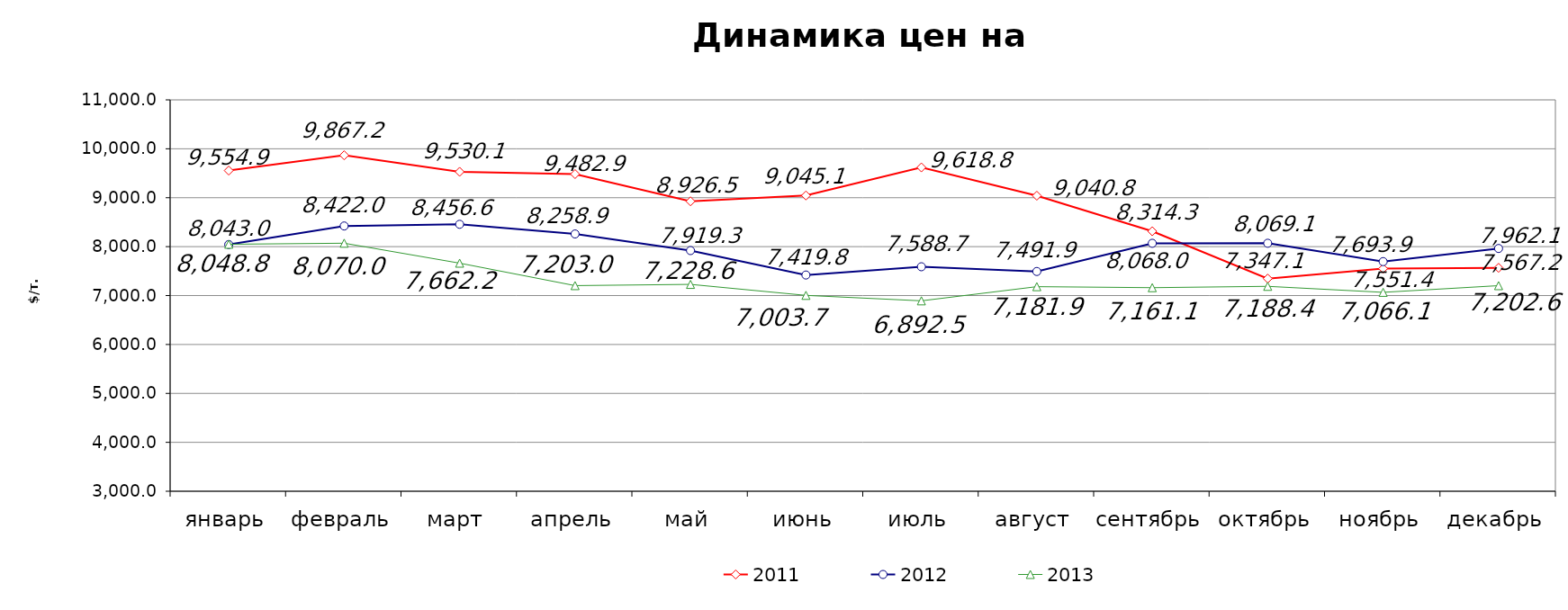
| Category | 2011 | 2012 | 2013 |
|---|---|---|---|
| январь | 9554.92 | 8043 | 8048.771 |
| февраль | 9867.18 | 8422.03 | 8070.02 |
| март | 9530.11 | 8456.55 | 7662.24 |
| апрель | 9482.91 | 8258.881 | 7202.97 |
| май | 8926.49 | 7919.286 | 7228.62 |
| июнь | 9045.12 | 7419.788 | 7003.715 |
| июль | 9618.8 | 7588.7 | 6892.509 |
| август | 9040.82 | 7491.9 | 7181.88 |
| сентябрь | 8314.33 | 8068 | 7161.11 |
| октябрь | 7347.105 | 8069.08 | 7188.38 |
| ноябрь | 7551.361 | 7693.92 | 7066.06 |
| декабрь | 7567.2 | 7962.09 | 7202.55 |